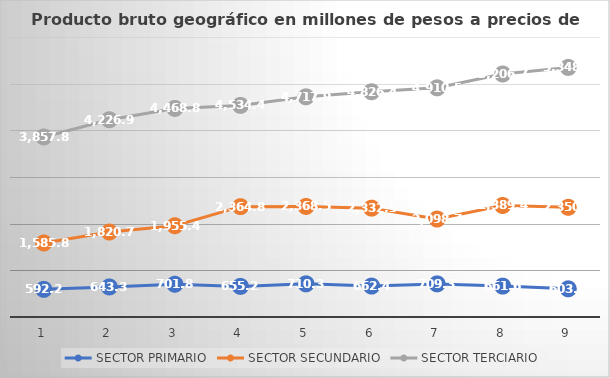
| Category | SECTOR PRIMARIO | SECTOR SECUNDARIO | SECTOR TERCIARIO |
|---|---|---|---|
| 0 | 592.264 | 1585.817 | 3857.842 |
| 1 | 643.365 | 1820.728 | 4226.966 |
| 2 | 701.891 | 1955.444 | 4468.883 |
| 3 | 655.252 | 2364.807 | 4534.399 |
| 4 | 710.298 | 2368.532 | 4717.947 |
| 5 | 662.432 | 2332.501 | 4826.448 |
| 6 | 709.363 | 2098.76 | 4910.529 |
| 7 | 661.679 | 2389.418 | 5206.7 |
| 8 | 603.777 | 2350.42 | 5348.074 |